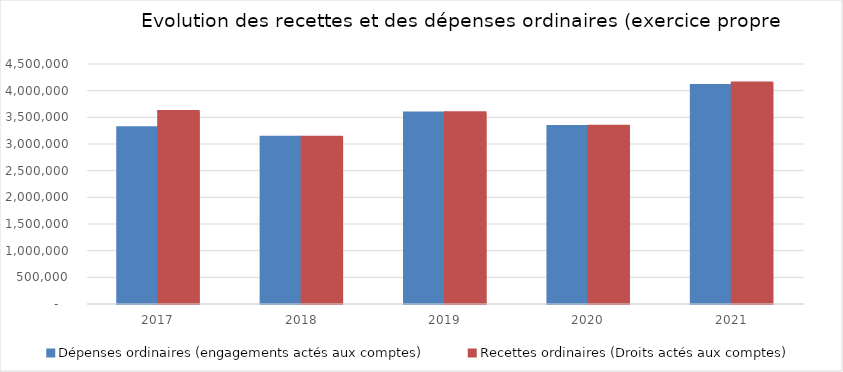
| Category | Dépenses ordinaires (engagements actés aux comptes) | Recettes ordinaires (Droits actés aux comptes) |
|---|---|---|
| 2017.0 | 3304499.17 | 3611289.68 |
| 2018.0 | 3127538.07 | 3127606.94 |
| 2019.0 | 3580719.98 | 3585818.28 |
| 2020.0 | 3326964.54 | 3332247.91 |
| 2021.0 | 4095472.37 | 4144565.36 |